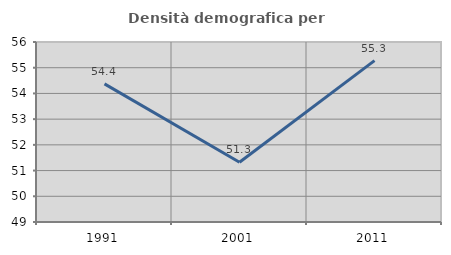
| Category | Densità demografica |
|---|---|
| 1991.0 | 54.371 |
| 2001.0 | 51.322 |
| 2011.0 | 55.274 |